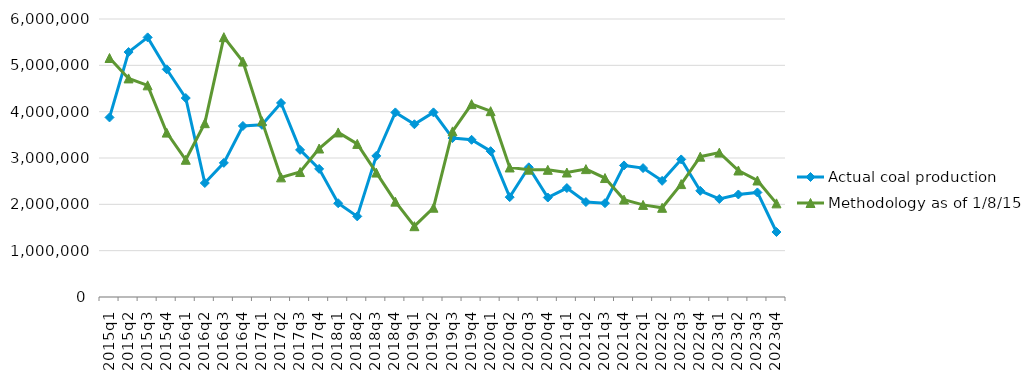
| Category | Actual coal production | Methodology as of 1/8/15 |
|---|---|---|
| 2015q1 | 3875388 | 5158197 |
| 2015q2 | 5286130 | 4717651 |
| 2015q3 | 5603407 | 4568057 |
| 2015q4 | 4913871 | 3547907 |
| 2016q1 | 4294769 | 2962015 |
| 2016q2 | 2459881 | 3751432 |
| 2016q3 | 2895003 | 5608083 |
| 2016q4 | 3691436 | 5081160 |
| 2017q1 | 3715557 | 3796088 |
| 2017q2 | 4187795 | 2582054 |
| 2017q3 | 3174875 | 2696949 |
| 2017q4 | 2765456 | 3204580 |
| 2018q1 | 2023070 | 3551505 |
| 2018q2 | 1740046 | 3304652 |
| 2018q3 | 3044977 | 2685541 |
| 2018q4 | 3983953 | 2058267 |
| 2019q1 | 3728141 | 1528193 |
| 2019q2 | 3984624 | 1926920 |
| 2019q3 | 3430141 | 3574838 |
| 2019q4 | 3392754 | 4163149 |
| 2020q1 | 3147773 | 4010417 |
| 2020q2 | 2155224 | 2795604 |
| 2020q3 | 2799294 | 2748068 |
| 2020q4 | 2146833 | 2745384 |
| 2021q1 | 2351614 | 2686454 |
| 2021q2 | 2049377 | 2759960 |
| 2021q3 | 2024673 | 2567394 |
| 2021q4 | 2839828 | 2102367 |
| 2022q1 | 2781858 | 1988023 |
| 2022q2 | 2507058 | 1925129 |
| 2022q3 | 2969139 | 2437072 |
| 2022q4 | 2291770 | 3028715 |
| 2023q1 | 2115831 | 3116132 |
| 2023q2 | 2212869 | 2730484 |
| 2023q3 | 2256177 | 2514449 |
| 2023q4 | 1402352 | 2020929 |